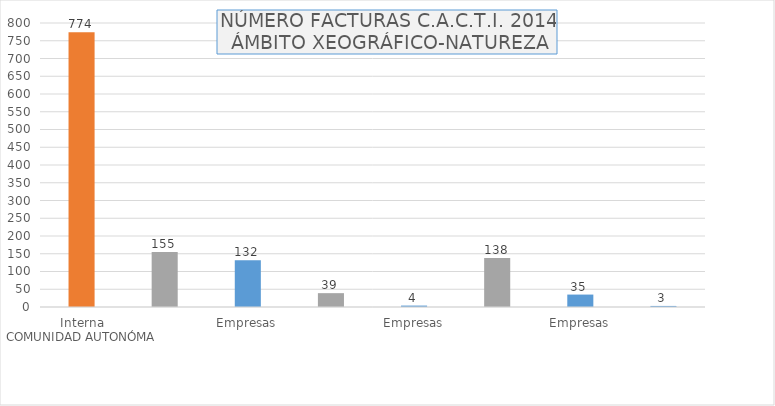
| Category | Series 0 |
|---|---|
| 0 | 774 |
| 1 | 155 |
| 2 | 132 |
| 3 | 39 |
| 4 | 4 |
| 5 | 138 |
| 6 | 35 |
| 7 | 3 |